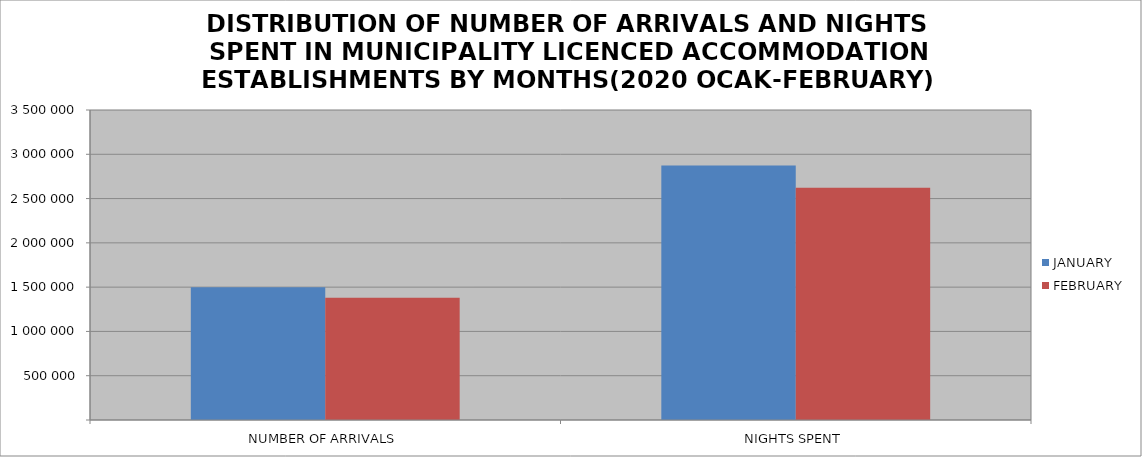
| Category | JANUARY | FEBRUARY |
|---|---|---|
| NUMBER OF ARRIVALS | 1497815 | 1380765 |
| NIGHTS SPENT | 2872303 | 2621819 |